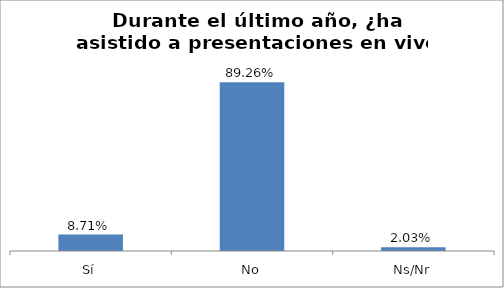
| Category | Total |
|---|---|
| Sí | 0.087 |
| No | 0.893 |
| Ns/Nr | 0.02 |